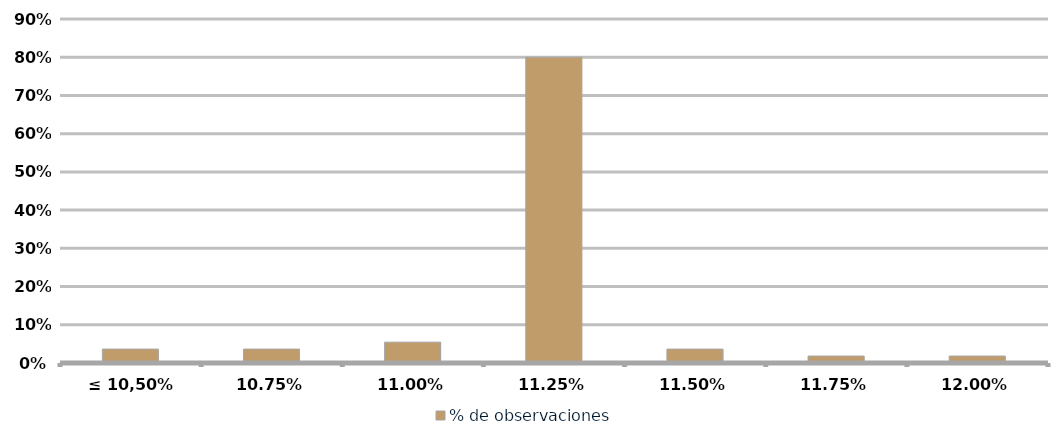
| Category | % de observaciones  |
|---|---|
| ≤ 10,50% | 0.036 |
| 10,75% | 0.036 |
| 11,00% | 0.055 |
| 11,25% | 0.8 |
| 11,50% | 0.036 |
| 11,75% | 0.018 |
| 12,00% | 0.018 |